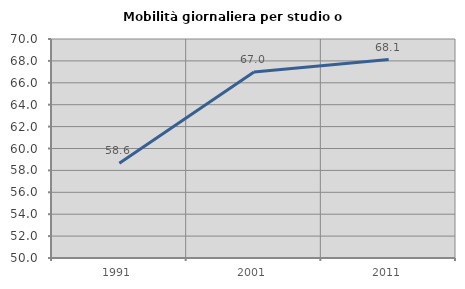
| Category | Mobilità giornaliera per studio o lavoro |
|---|---|
| 1991.0 | 58.645 |
| 2001.0 | 66.981 |
| 2011.0 | 68.126 |